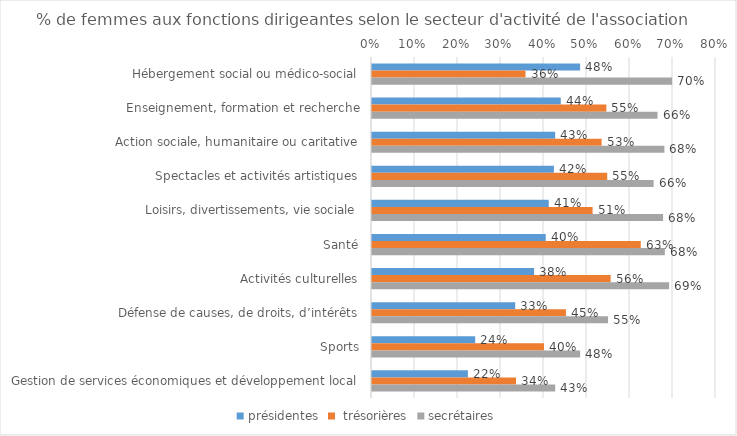
| Category | présidentes |  trésorières | secrétaires |
|---|---|---|---|
| Hébergement social ou médico-social | 0.484 | 0.357 | 0.698 |
| Enseignement, formation et recherche | 0.439 | 0.545 | 0.664 |
| Action sociale, humanitaire ou caritative | 0.426 | 0.534 | 0.68 |
| Spectacles et activités artistiques | 0.423 | 0.547 | 0.655 |
| Loisirs, divertissements, vie sociale | 0.411 | 0.513 | 0.677 |
| Santé | 0.404 | 0.625 | 0.681 |
| Activités culturelles | 0.377 | 0.555 | 0.691 |
| Défense de causes, de droits, d’intérêts | 0.333 | 0.451 | 0.549 |
| Sports | 0.24 | 0.4 | 0.484 |
| Gestion de services économiques et développement local | 0.223 | 0.335 | 0.426 |